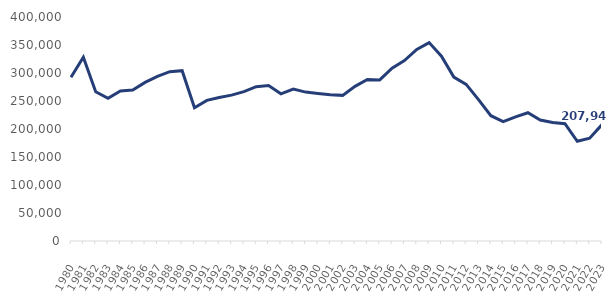
| Category | Series 0 |
|---|---|
| 1980.0 | 292316 |
| 1981.0 | 328082 |
| 1982.0 | 266559 |
| 1983.0 | 254684 |
| 1984.0 | 268028 |
| 1985.0 | 269681 |
| 1986.0 | 283225 |
| 1987.0 | 294031 |
| 1988.0 | 302438 |
| 1989.0 | 304116 |
| 1990.0 | 237942 |
| 1991.0 | 251059 |
| 1992.0 | 256306 |
| 1993.0 | 260493 |
| 1994.0 | 266792 |
| 1995.0 | 275563 |
| 1996.0 | 277647 |
| 1997.0 | 262881 |
| 1998.0 | 271343 |
| 1999.0 | 265910 |
| 2000.0 | 263553 |
| 2001.0 | 261089 |
| 2002.0 | 260070 |
| 2003.0 | 276089 |
| 2004.0 | 288306 |
| 2005.0 | 287654 |
| 2006.0 | 308708 |
| 2007.0 | 322101 |
| 2008.0 | 342005 |
| 2009.0 | 354326 |
| 2010.0 | 329995 |
| 2011.0 | 292616 |
| 2012.0 | 279704 |
| 2013.0 | 252434 |
| 2014.0 | 223721 |
| 2015.0 | 213071 |
| 2016.0 | 221736 |
| 2017.0 | 229007 |
| 2018.0 | 216098 |
| 2019.0 | 211554 |
| 2020.0 | 209584 |
| 2021.0 | 178094 |
| 2022.0 | 183459 |
| 2023.0 | 207943 |